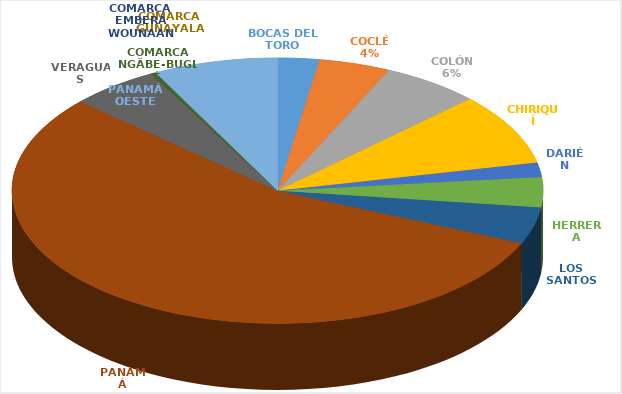
| Category | Cantidad  |
|---|---|
| BOCAS DEL TORO | 147 |
| COCLÉ | 253 |
| COLÓN | 348 |
| CHIRIQUÍ | 506 |
| DARIÉN | 102 |
| HERRERA | 213 |
| LOS SANTOS | 259 |
| PANAMÁ | 3207 |
| VERAGUAS | 311 |
| COMARCA GUNAYALA | 4 |
| COMARCA EMBERÁ WOUNAAN | 1 |
| COMARCA NGÄBE-BUGLÉ | 15 |
| PANAMÁ OESTE | 441 |